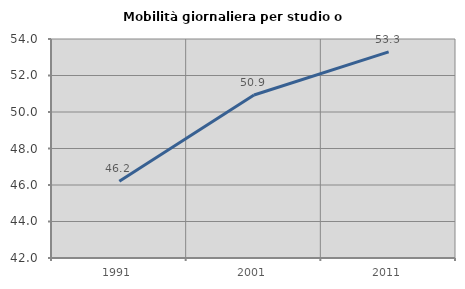
| Category | Mobilità giornaliera per studio o lavoro |
|---|---|
| 1991.0 | 46.203 |
| 2001.0 | 50.934 |
| 2011.0 | 53.298 |